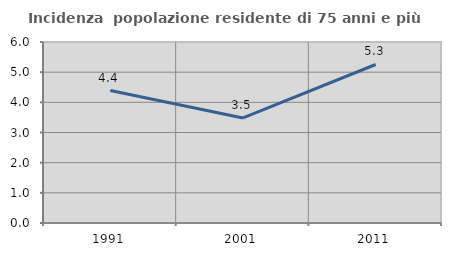
| Category | Incidenza  popolazione residente di 75 anni e più |
|---|---|
| 1991.0 | 4.39 |
| 2001.0 | 3.482 |
| 2011.0 | 5.254 |